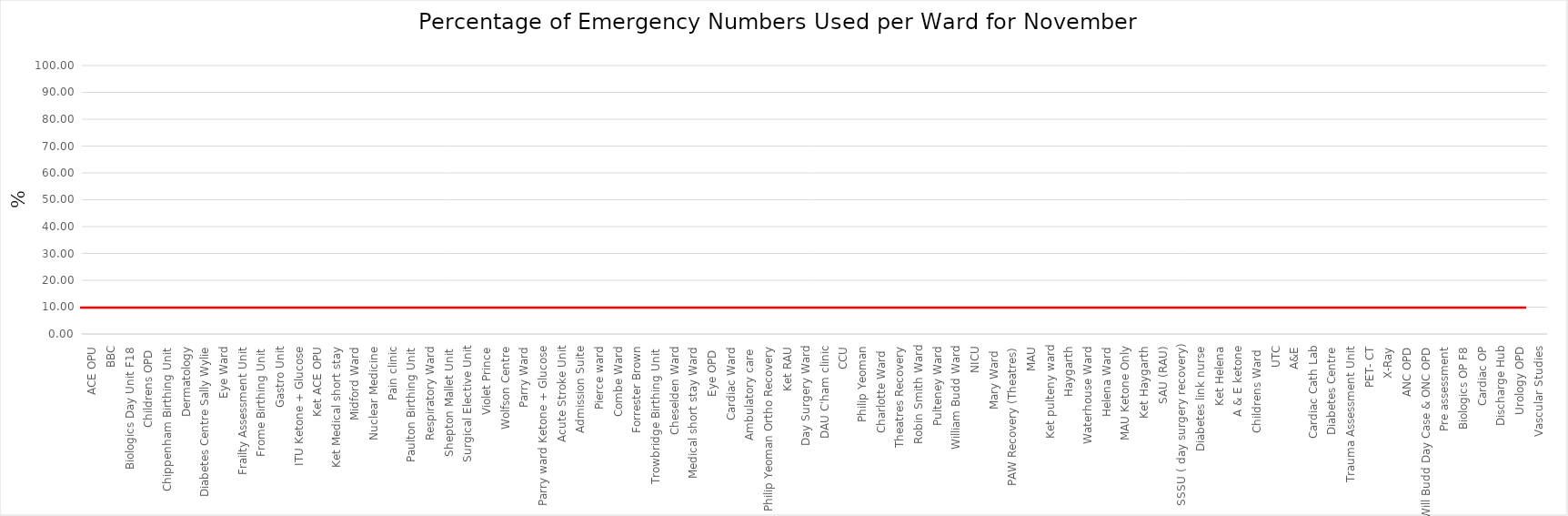
| Category | Series 0 |
|---|---|
| ACE OPU | 0 |
| BBC | 0 |
| Biologics Day Unit F18 | 0 |
| Childrens OPD  | 0 |
| Chippenham Birthing Unit  | 0 |
| Dermatology | 0 |
| Diabetes Centre Sally Wylie | 0 |
| Eye Ward | 0 |
| Frailty Assessment Unit | 0 |
| Frome Birthing Unit  | 0 |
| Gastro Unit | 0 |
| ITU Ketone + Glucose | 0 |
| Ket ACE OPU | 0 |
| Ket Medical short stay | 0 |
| Midford Ward | 0 |
| Nuclear Medicine | 0 |
| Pain clinic | 0 |
| Paulton Birthing Unit  | 0 |
| Respiratory Ward | 0 |
| Shepton Mallet Unit  | 0 |
| Surgical Elective Unit | 0 |
| Violet Prince | 0 |
| Wolfson Centre | 0 |
| Parry Ward | 0 |
| Parry ward Ketone + Glucose | 0 |
| Acute Stroke Unit | 0 |
| Admission Suite | 0 |
| Pierce ward | 0 |
| Combe Ward | 0 |
| Forrester Brown | 0 |
| Trowbridge Birthing Unit  | 0 |
| Cheselden Ward | 0 |
| Medical short stay Ward | 0 |
| Eye OPD  | 0 |
| Cardiac Ward | 0 |
| Ambulatory care  | 0 |
| Philip Yeoman Ortho Recovery | 0 |
| Ket RAU | 0 |
| Day Surgery Ward | 0 |
| DAU C'ham clinic | 0 |
| CCU | 0 |
| Philip Yeoman | 0 |
| Charlotte Ward  | 0 |
| Theatres Recovery | 0 |
| Robin Smith Ward | 0 |
| Pulteney Ward | 0 |
| William Budd Ward | 0 |
| NICU | 0 |
| Mary Ward  | 0 |
| PAW Recovery (Theatres) | 0 |
| MAU | 0 |
| Ket pulteny ward | 0 |
| Haygarth | 0 |
| Waterhouse Ward | 0 |
| Helena Ward | 0 |
| MAU Ketone Only | 0 |
| Ket Haygarth | 0 |
| SAU (RAU) | 0 |
| SSSU ( day surgery recovery) | 0 |
| Diabetes link nurse | 0 |
| Ket Helena | 0 |
| A & E ketone | 0 |
| Childrens Ward  | 0 |
| UTC | 0 |
| A&E | 0 |
| Cardiac Cath Lab | 0 |
| Diabetes Centre | 0 |
| Trauma Assessment Unit | 0 |
| PET- CT | 0 |
| X-Ray | 0 |
| ANC OPD | 0 |
| Will Budd Day Case & ONC OPD | 0 |
| Pre assessment | 0 |
| Biologics OP F8 | 0 |
| Cardiac OP | 0 |
| Discharge Hub | 0 |
| Urology OPD | 0 |
| Vascular Studies | 0 |